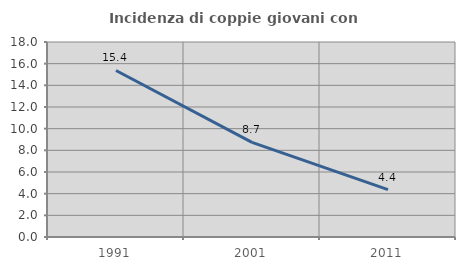
| Category | Incidenza di coppie giovani con figli |
|---|---|
| 1991.0 | 15.37 |
| 2001.0 | 8.731 |
| 2011.0 | 4.377 |